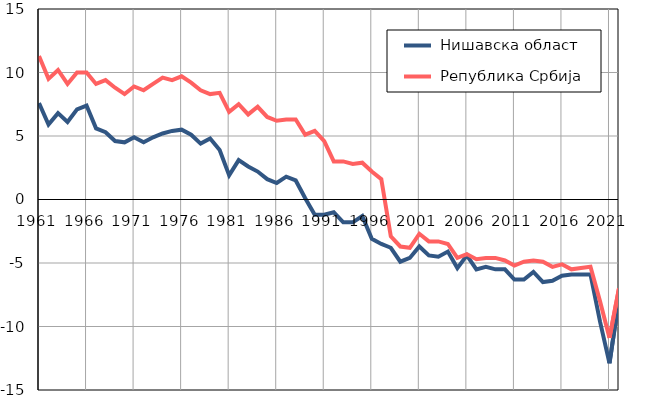
| Category |  Нишавска област |  Република Србија |
|---|---|---|
| 1961.0 | 7.6 | 11.3 |
| 1962.0 | 5.9 | 9.5 |
| 1963.0 | 6.8 | 10.2 |
| 1964.0 | 6.1 | 9.1 |
| 1965.0 | 7.1 | 10 |
| 1966.0 | 7.4 | 10 |
| 1967.0 | 5.6 | 9.1 |
| 1968.0 | 5.3 | 9.4 |
| 1969.0 | 4.6 | 8.8 |
| 1970.0 | 4.5 | 8.3 |
| 1971.0 | 4.9 | 8.9 |
| 1972.0 | 4.5 | 8.6 |
| 1973.0 | 4.9 | 9.1 |
| 1974.0 | 5.2 | 9.6 |
| 1975.0 | 5.4 | 9.4 |
| 1976.0 | 5.5 | 9.7 |
| 1977.0 | 5.1 | 9.2 |
| 1978.0 | 4.4 | 8.6 |
| 1979.0 | 4.8 | 8.3 |
| 1980.0 | 3.9 | 8.4 |
| 1981.0 | 1.9 | 6.9 |
| 1982.0 | 3.1 | 7.5 |
| 1983.0 | 2.6 | 6.7 |
| 1984.0 | 2.2 | 7.3 |
| 1985.0 | 1.6 | 6.5 |
| 1986.0 | 1.3 | 6.2 |
| 1987.0 | 1.8 | 6.3 |
| 1988.0 | 1.5 | 6.3 |
| 1989.0 | 0.1 | 5.1 |
| 1990.0 | -1.2 | 5.4 |
| 1991.0 | -1.2 | 4.6 |
| 1992.0 | -1 | 3 |
| 1993.0 | -1.8 | 3 |
| 1994.0 | -1.8 | 2.8 |
| 1995.0 | -1.3 | 2.9 |
| 1996.0 | -3.1 | 2.2 |
| 1997.0 | -3.5 | 1.6 |
| 1998.0 | -3.8 | -2.9 |
| 1999.0 | -4.9 | -3.7 |
| 2000.0 | -4.6 | -3.8 |
| 2001.0 | -3.7 | -2.7 |
| 2002.0 | -4.4 | -3.3 |
| 2003.0 | -4.5 | -3.3 |
| 2004.0 | -4.1 | -3.5 |
| 2005.0 | -5.4 | -4.6 |
| 2006.0 | -4.4 | -4.3 |
| 2007.0 | -5.5 | -4.7 |
| 2008.0 | -5.3 | -4.6 |
| 2009.0 | -5.5 | -4.6 |
| 2010.0 | -5.5 | -4.8 |
| 2011.0 | -6.3 | -5.2 |
| 2012.0 | -6.3 | -4.9 |
| 2013.0 | -5.7 | -4.8 |
| 2014.0 | -6.5 | -4.9 |
| 2015.0 | -6.4 | -5.3 |
| 2016.0 | -6 | -5.1 |
| 2017.0 | -5.9 | -5.5 |
| 2018.0 | -5.9 | -5.4 |
| 2019.0 | -5.9 | -5.3 |
| 2020.0 | -9.6 | -8 |
| 2021.0 | -12.9 | -10.9 |
| 2022.0 | -7.8 | -7 |